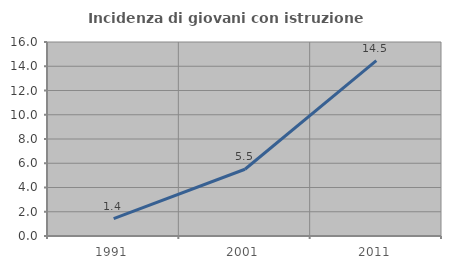
| Category | Incidenza di giovani con istruzione universitaria |
|---|---|
| 1991.0 | 1.429 |
| 2001.0 | 5.505 |
| 2011.0 | 14.458 |